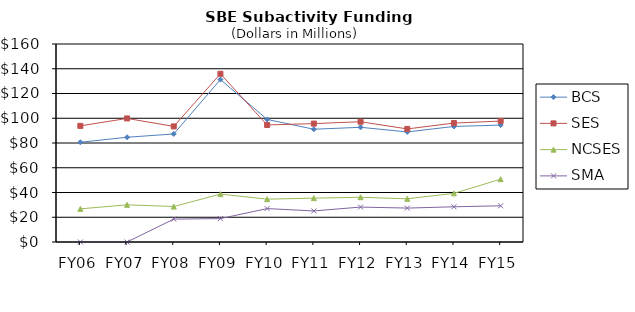
| Category | BCS | SES | NCSES | SMA |
|---|---|---|---|---|
| FY06 | 80.6 | 93.84 | 26.79 | 0 |
| FY07 | 84.64 | 99.86 | 30.04 | 0 |
| FY08 | 87.3 | 93.4 | 28.66 | 18.51 |
| FY09 | 131.28 | 135.92 | 38.71 | 18.91 |
| FY10 | 99.05 | 94.58 | 34.62 | 27 |
| FY11 | 91.114 | 95.676 | 35.439 | 25.096 |
| FY12 | 92.69 | 97.18 | 36.15 | 28.23 |
| FY13 | 88.92 | 91.37 | 34.92 | 27.41 |
| FY14 | 93.39 | 96.11 | 39.3 | 28.47 |
| FY15 | 94.47 | 97.72 | 50.76 | 29.25 |